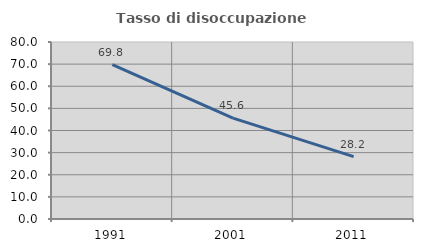
| Category | Tasso di disoccupazione giovanile  |
|---|---|
| 1991.0 | 69.756 |
| 2001.0 | 45.578 |
| 2011.0 | 28.205 |